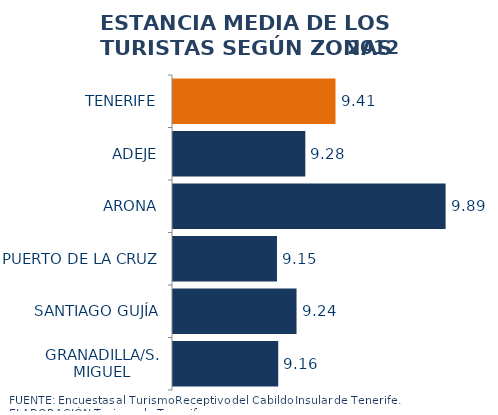
| Category | 2012 |
|---|---|
| TENERIFE | 9.407 |
| ADEJE | 9.275 |
| ARONA | 9.885 |
| PUERTO DE LA CRUZ | 9.152 |
| SANTIAGO GUJÍA | 9.237 |
| GRANADILLA/S. MIGUEL | 9.157 |